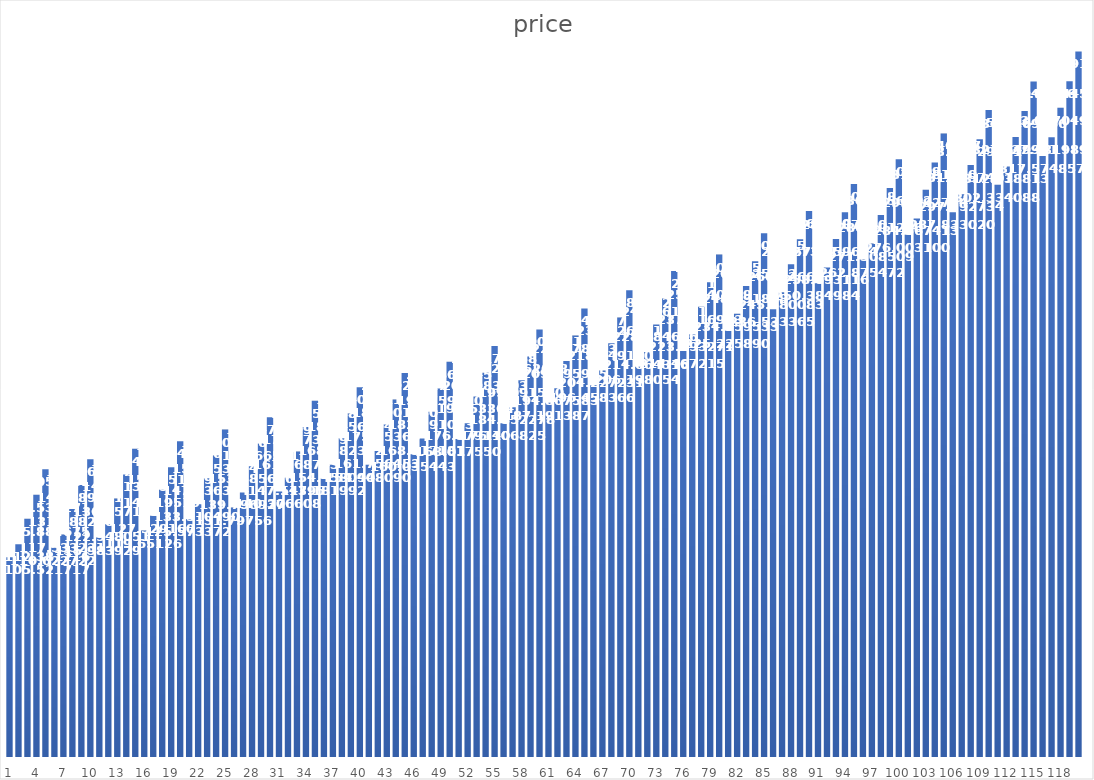
| Category | price |
|---|---|
| 0 | 105.522 |
| 1 | 112.381 |
| 2 | 125.885 |
| 3 | 138.534 |
| 4 | 152.057 |
| 5 | 110.623 |
| 6 | 117.533 |
| 7 | 131.088 |
| 8 | 143.79 |
| 9 | 157.365 |
| 10 | 115.984 |
| 11 | 122.948 |
| 12 | 136.557 |
| 13 | 149.313 |
| 14 | 162.944 |
| 15 | 119.651 |
| 16 | 127.529 |
| 17 | 141.195 |
| 18 | 153.152 |
| 19 | 166.84 |
| 20 | 125.573 |
| 21 | 133.51 |
| 22 | 147.236 |
| 23 | 159.253 |
| 24 | 173.003 |
| 25 | 131.798 |
| 26 | 139.797 |
| 27 | 153.586 |
| 28 | 165.666 |
| 29 | 179.48 |
| 30 | 140.307 |
| 31 | 147.514 |
| 32 | 161.369 |
| 33 | 174.373 |
| 34 | 188.255 |
| 35 | 147.182 |
| 36 | 154.458 |
| 37 | 168.382 |
| 38 | 181.457 |
| 39 | 195.409 |
| 40 | 154.408 |
| 41 | 161.756 |
| 42 | 175.754 |
| 43 | 188.902 |
| 44 | 202.929 |
| 45 | 160.035 |
| 46 | 168.317 |
| 47 | 182.391 |
| 48 | 194.759 |
| 49 | 208.864 |
| 50 | 168.018 |
| 51 | 176.379 |
| 52 | 190.534 |
| 53 | 202.983 |
| 54 | 217.171 |
| 55 | 176.407 |
| 56 | 184.852 |
| 57 | 199.092 |
| 58 | 211.627 |
| 59 | 225.9 |
| 60 | 187.191 |
| 61 | 194.868 |
| 62 | 209.196 |
| 63 | 222.679 |
| 64 | 237.043 |
| 65 | 196.458 |
| 66 | 204.227 |
| 67 | 218.649 |
| 68 | 232.226 |
| 69 | 246.686 |
| 70 | 206.198 |
| 71 | 214.064 |
| 72 | 228.585 |
| 73 | 242.261 |
| 74 | 256.821 |
| 75 | 214.467 |
| 76 | 223.293 |
| 77 | 237.917 |
| 78 | 250.841 |
| 79 | 265.506 |
| 80 | 225.226 |
| 81 | 234.16 |
| 82 | 248.892 |
| 83 | 261.925 |
| 84 | 276.702 |
| 85 | 236.533 |
| 86 | 245.58 |
| 87 | 260.427 |
| 88 | 273.575 |
| 89 | 288.468 |
| 90 | 250.385 |
| 91 | 258.693 |
| 92 | 273.66 |
| 93 | 287.787 |
| 94 | 302.803 |
| 95 | 262.875 |
| 96 | 271.309 |
| 97 | 286.401 |
| 98 | 300.656 |
| 99 | 315.8 |
| 100 | 276.003 |
| 101 | 284.567 |
| 102 | 299.793 |
| 103 | 314.181 |
| 104 | 329.461 |
| 105 | 287.833 |
| 106 | 297.393 |
| 107 | 312.757 |
| 108 | 326.429 |
| 109 | 341.851 |
| 110 | 302.334 |
| 111 | 312.039 |
| 112 | 327.55 |
| 113 | 341.37 |
| 114 | 356.941 |
| 115 | 317.575 |
| 116 | 327.432 |
| 117 | 343.097 |
| 118 | 357.072 |
| 119 | 372.8 |